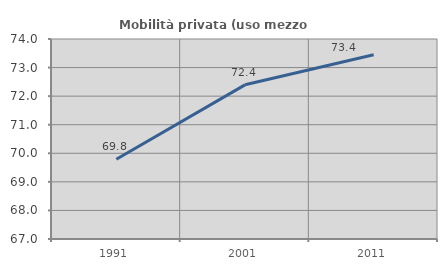
| Category | Mobilità privata (uso mezzo privato) |
|---|---|
| 1991.0 | 69.792 |
| 2001.0 | 72.396 |
| 2011.0 | 73.446 |